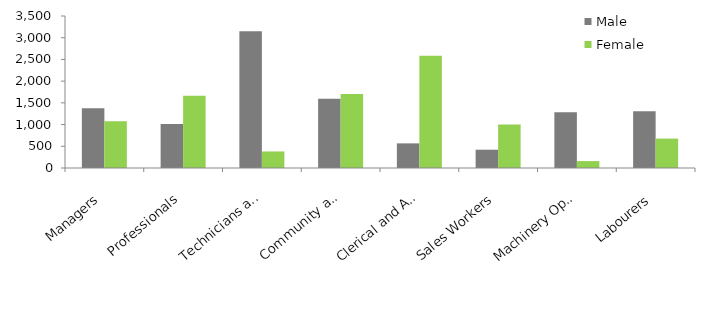
| Category | Male | Female |
|---|---|---|
| Managers | 1377 | 1079 |
| Professionals | 1015 | 1665 |
| Technicians and Trades Workers | 3146 | 381 |
| Community and Personal Service Workers | 1595 | 1704 |
| Clerical and Administrative Workers | 567 | 2583 |
| Sales Workers | 421 | 1000 |
| Machinery Operators and Drivers | 1285 | 159 |
| Labourers | 1306 | 677 |